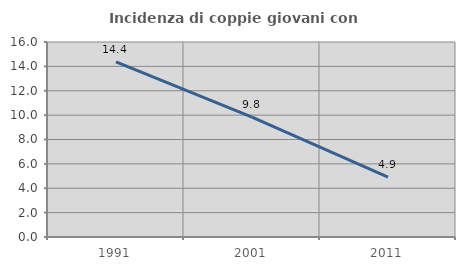
| Category | Incidenza di coppie giovani con figli |
|---|---|
| 1991.0 | 14.374 |
| 2001.0 | 9.844 |
| 2011.0 | 4.915 |